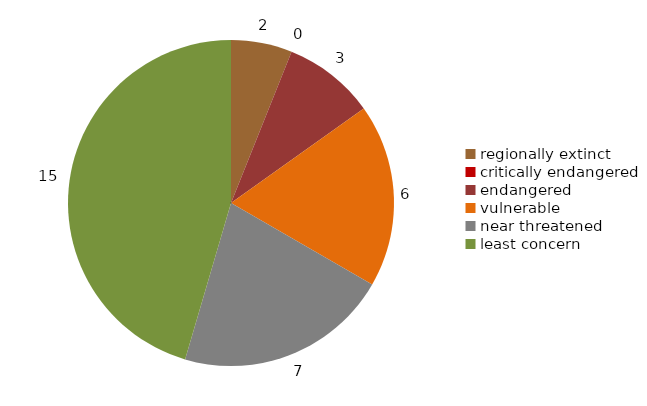
| Category | Series 0 |
|---|---|
| regionally extinct | 2 |
| critically endangered | 0 |
| endangered | 3 |
| vulnerable | 6 |
| near threatened | 7 |
| least concern | 15 |